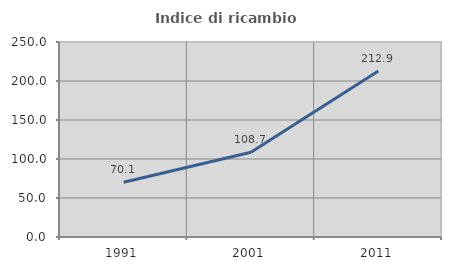
| Category | Indice di ricambio occupazionale  |
|---|---|
| 1991.0 | 70.116 |
| 2001.0 | 108.685 |
| 2011.0 | 212.857 |